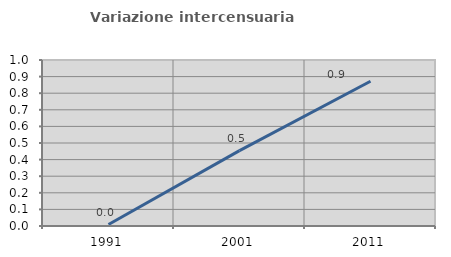
| Category | Variazione intercensuaria annua |
|---|---|
| 1991.0 | 0.009 |
| 2001.0 | 0.454 |
| 2011.0 | 0.872 |